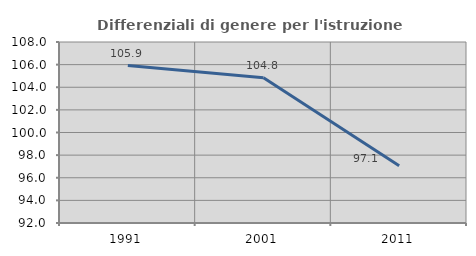
| Category | Differenziali di genere per l'istruzione superiore |
|---|---|
| 1991.0 | 105.921 |
| 2001.0 | 104.834 |
| 2011.0 | 97.069 |